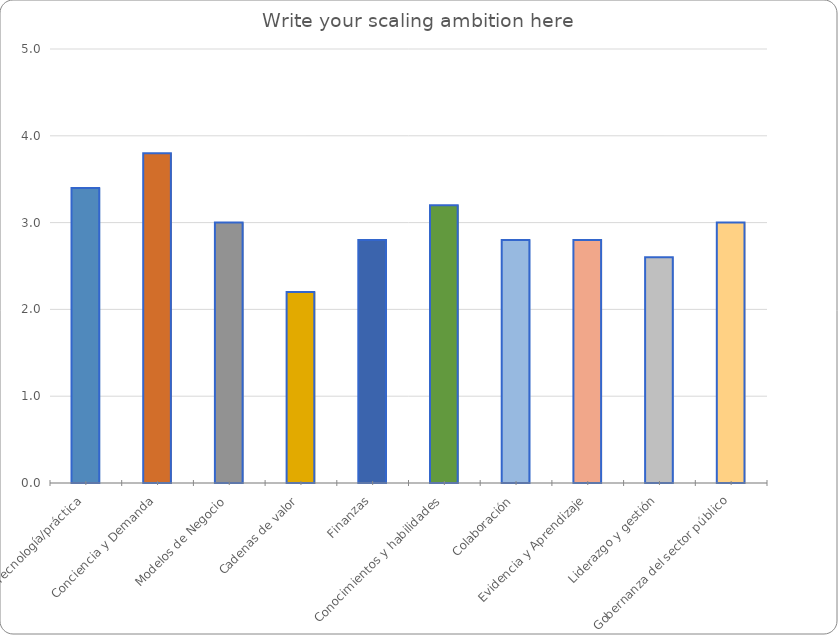
| Category | Series 0 |
|---|---|
| Tecnología/práctica | 3.4 |
| Conciencia y Demanda | 3.8 |
| Modelos de Negocio | 3 |
| Cadenas de valor | 2.2 |
| Finanzas | 2.8 |
| Conocimientos y habilidades | 3.2 |
| Colaboración | 2.8 |
| Evidencia y Aprendizaje | 2.8 |
| Liderazgo y gestión | 2.6 |
| Gobernanza del sector público | 3 |